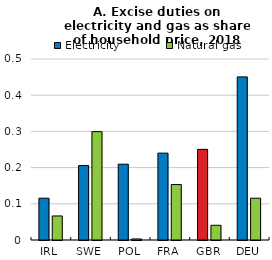
| Category | Electricity | Natural gas |
|---|---|---|
| IRL | 0.115 | 0.066 |
| SWE | 0.206 | 0.299 |
| POL | 0.209 | 0.003 |
| FRA | 0.24 | 0.153 |
| GBR | 0.25 | 0.041 |
| DEU | 0.451 | 0.115 |